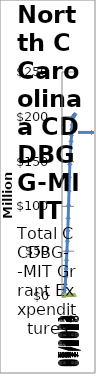
| Category | Projected Expenditures | Actual Expenditure |
|---|---|---|
| 07/2021 | 1469133.887 | 317236 |
| 10/2021 | 2092276.231 | 346652.92 |
| 01/2022 | 3400940.542 | 393251.51 |
| 04/2022 | 6156348.257 | 1084981.7 |
| 07/2022 | 8983625.807 | 1134493.33 |
| 10/2022 | 13120903.358 | 1265968.76 |
| 01/2023 | 21040576.974 | 1265968.76 |
| 04/2023 | 30465080.709 | 1265968.76 |
| 07/2023 | 39930436.771 | 1265968.76 |
| 10/2023 | 50069225.98 | 1265968.76 |
| 01/2023 | 61130688.181 | 1265968.76 |
| 04/2023 | 72799792.374 | 1265968.76 |
| 07/2023 | 86547034.099 | 1265968.76 |
| 10/2023 | 101270629.424 | 1265968.76 |
| 01/2024 | 116993248.574 | 1265968.76 |
| 04/2024 | 132621004.612 | 1265968.76 |
| 07/2024 | 146748760.649 | 1265968.76 |
| 10/2024 | 156627619.047 | 1265968.76 |
| 01/2025 | 165023316.109 | 1265968.76 |
| 04/2025 | 172585231.776 | 1265968.76 |
| 07/2025 | 179277691.887 | 1265968.76 |
| 10/2026 | 185970151.999 | 1265968.76 |
| 01/2027 | 191065386.295 | 1265968.76 |
| 04/2027 | 195560621.592 | 1265968.76 |
| 07/2027 | 199160316.666 | 1265968.76 |
| 10/2027 | 200435301.551 | 1265968.76 |
| 01/2028 | 201560286.436 | 1265968.76 |
| 04/2028 | 202115866.092 | 1265968.76 |
| 07/2028 | 202685999.747 | 1265968.76 |